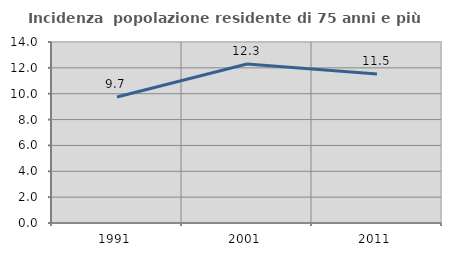
| Category | Incidenza  popolazione residente di 75 anni e più |
|---|---|
| 1991.0 | 9.741 |
| 2001.0 | 12.299 |
| 2011.0 | 11.518 |